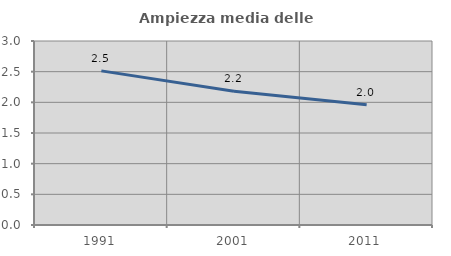
| Category | Ampiezza media delle famiglie |
|---|---|
| 1991.0 | 2.513 |
| 2001.0 | 2.179 |
| 2011.0 | 1.962 |